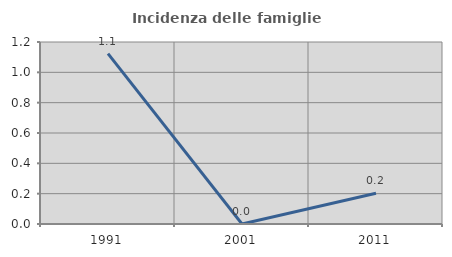
| Category | Incidenza delle famiglie numerose |
|---|---|
| 1991.0 | 1.124 |
| 2001.0 | 0 |
| 2011.0 | 0.203 |